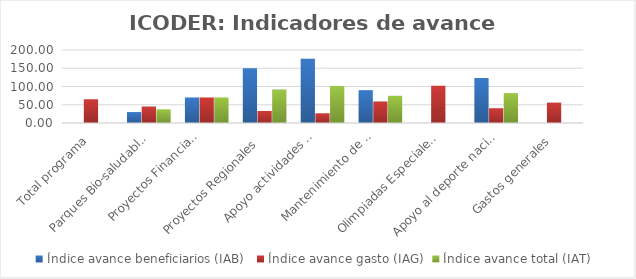
| Category | Índice avance beneficiarios (IAB)  | Índice avance gasto (IAG) | Índice avance total (IAT)  |
|---|---|---|---|
| Total programa | 0 | 65.078 | 0 |
| Parques Bio-saludables | 30 | 45.064 | 37.532 |
| Proyectos Financiados 
a CCDR | 70 | 70 | 70 |
| Proyectos Regionales  | 150 | 33.028 | 91.514 |
| Apoyo actividades 
recreativas y deportivas  | 176 | 26.641 | 101.321 |
| Mantenimiento de 
Instalaciones Deportivas  | 90 | 58.862 | 74.431 |
| Olimpiadas Especiales  | 0 | 102.007 | 0 |
| Apoyo al deporte nacional | 123.333 | 40.523 | 81.928 |
| Gastos generales | 0 | 55.75 | 0 |